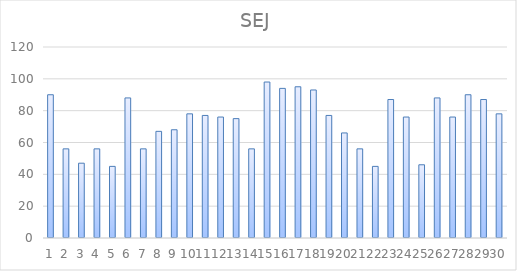
| Category | SEJ |
|---|---|
| 0 | 90 |
| 1 | 56 |
| 2 | 47 |
| 3 | 56 |
| 4 | 45 |
| 5 | 88 |
| 6 | 56 |
| 7 | 67 |
| 8 | 68 |
| 9 | 78 |
| 10 | 77 |
| 11 | 76 |
| 12 | 75 |
| 13 | 56 |
| 14 | 98 |
| 15 | 94 |
| 16 | 95 |
| 17 | 93 |
| 18 | 77 |
| 19 | 66 |
| 20 | 56 |
| 21 | 45 |
| 22 | 87 |
| 23 | 76 |
| 24 | 46 |
| 25 | 88 |
| 26 | 76 |
| 27 | 90 |
| 28 | 87 |
| 29 | 78 |